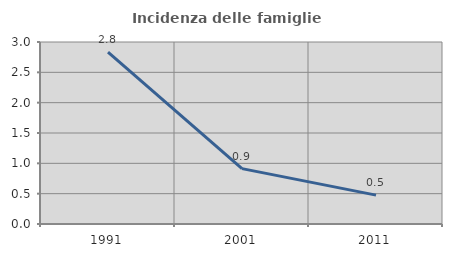
| Category | Incidenza delle famiglie numerose |
|---|---|
| 1991.0 | 2.834 |
| 2001.0 | 0.913 |
| 2011.0 | 0.476 |